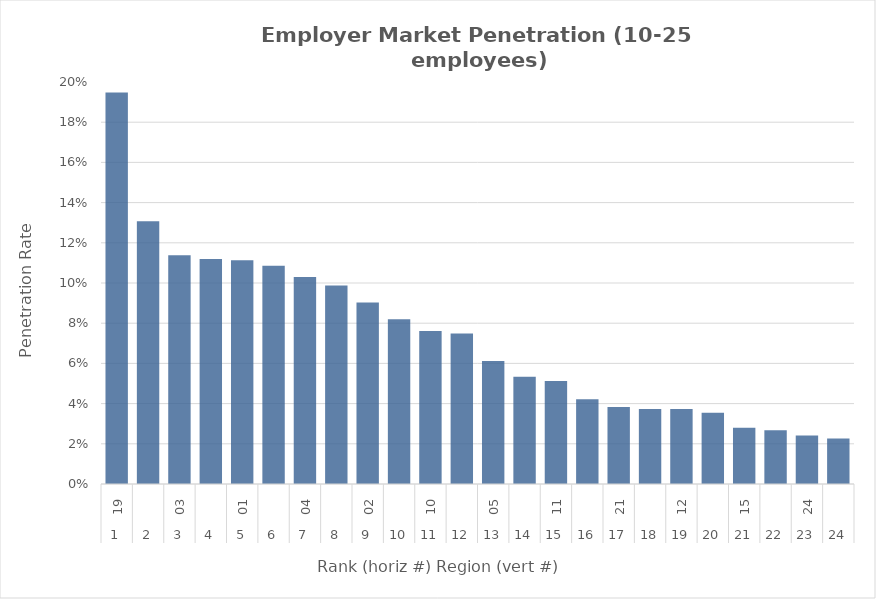
| Category | Rate |
|---|---|
| 0 | 0.195 |
| 1 | 0.131 |
| 2 | 0.114 |
| 3 | 0.112 |
| 4 | 0.111 |
| 5 | 0.109 |
| 6 | 0.103 |
| 7 | 0.099 |
| 8 | 0.09 |
| 9 | 0.082 |
| 10 | 0.076 |
| 11 | 0.075 |
| 12 | 0.061 |
| 13 | 0.053 |
| 14 | 0.051 |
| 15 | 0.042 |
| 16 | 0.038 |
| 17 | 0.037 |
| 18 | 0.037 |
| 19 | 0.035 |
| 20 | 0.028 |
| 21 | 0.027 |
| 22 | 0.024 |
| 23 | 0.023 |